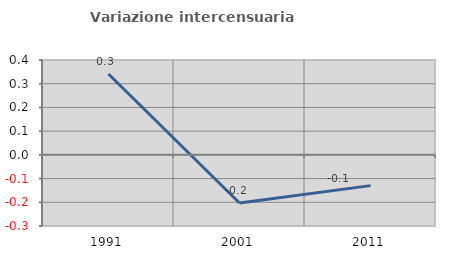
| Category | Variazione intercensuaria annua |
|---|---|
| 1991.0 | 0.341 |
| 2001.0 | -0.203 |
| 2011.0 | -0.13 |